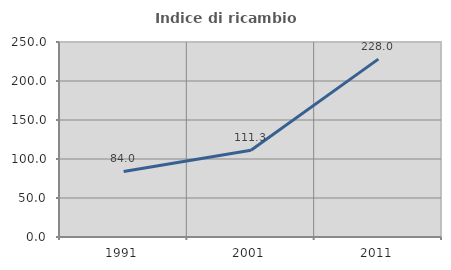
| Category | Indice di ricambio occupazionale  |
|---|---|
| 1991.0 | 83.986 |
| 2001.0 | 111.323 |
| 2011.0 | 228.018 |